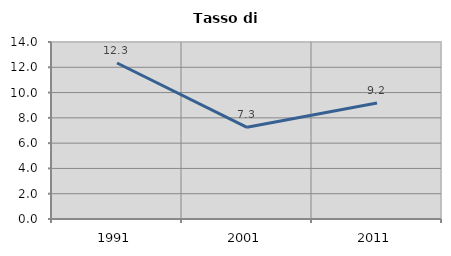
| Category | Tasso di disoccupazione   |
|---|---|
| 1991.0 | 12.339 |
| 2001.0 | 7.251 |
| 2011.0 | 9.169 |